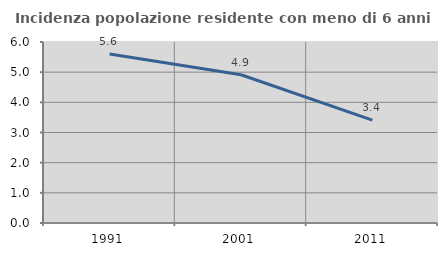
| Category | Incidenza popolazione residente con meno di 6 anni |
|---|---|
| 1991.0 | 5.602 |
| 2001.0 | 4.915 |
| 2011.0 | 3.408 |